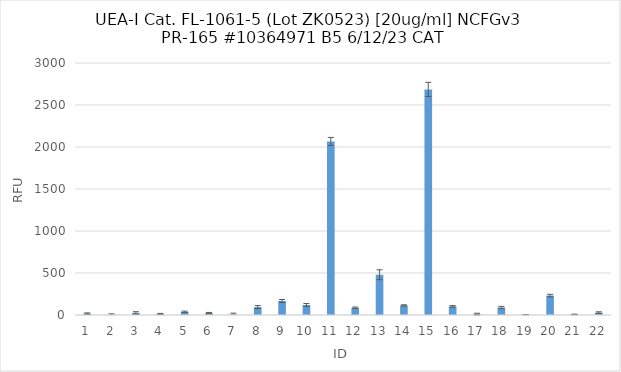
| Category | RFU |
|---|---|
| 0 | 17.25 |
| 1 | 3.5 |
| 2 | 25.5 |
| 3 | 12.5 |
| 4 | 37 |
| 5 | 23 |
| 6 | 6.75 |
| 7 | 94.5 |
| 8 | 166.75 |
| 9 | 119.5 |
| 10 | 2066 |
| 11 | 85.75 |
| 12 | 479 |
| 13 | 114.25 |
| 14 | 2685.75 |
| 15 | 102.25 |
| 16 | 10.5 |
| 17 | 88.75 |
| 18 | 4.25 |
| 19 | 231.25 |
| 20 | 7 |
| 21 | 28 |